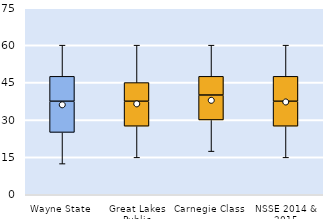
| Category | 25th | 50th | 75th |
|---|---|---|---|
| Wayne State | 25 | 12.5 | 10 |
| Great Lakes Public | 27.5 | 10 | 7.5 |
| Carnegie Class | 30 | 10 | 7.5 |
| NSSE 2014 & 2015 | 27.5 | 10 | 10 |